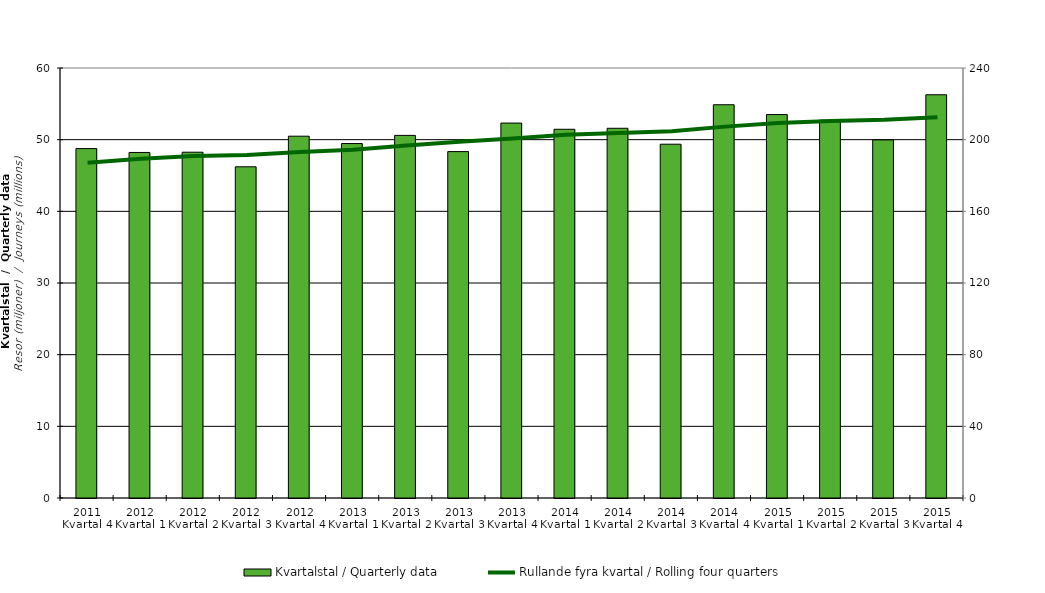
| Category | Kvartalstal / Quarterly data |
|---|---|
| 2011 Kvartal 4 | 48.753 |
| 2012 Kvartal 1 | 48.214 |
| 2012 Kvartal 2 | 48.25 |
| 2012 Kvartal 3 | 46.215 |
| 2012 Kvartal 4 | 50.484 |
| 2013 Kvartal 1 | 49.458 |
| 2013 Kvartal 2 | 50.596 |
| 2013 Kvartal 3 | 48.335 |
| 2013 Kvartal 4 | 52.317 |
| 2014 Kvartal 1 | 51.451 |
| 2014 Kvartal 2 | 51.589 |
| 2014 Kvartal 3 | 49.366 |
| 2014 Kvartal 4 | 54.874 |
| 2015 Kvartal 1 | 53.503 |
| 2015 Kvartal 2 | 52.724 |
| 2015 Kvartal 3 | 49.971 |
| 2015 Kvartal 4 | 56.267 |